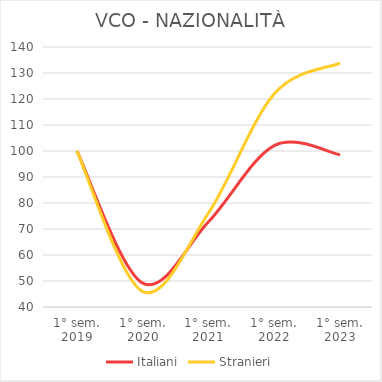
| Category | Italiani | Stranieri |
|---|---|---|
| 1° sem.
2019 | 100 | 100 |
| 1° sem.
2020 | 49.183 | 45.934 |
| 1° sem.
2021 | 72.784 | 76.139 |
| 1° sem.
2022 | 102.095 | 121.984 |
| 1° sem.
2023 | 98.549 | 133.78 |